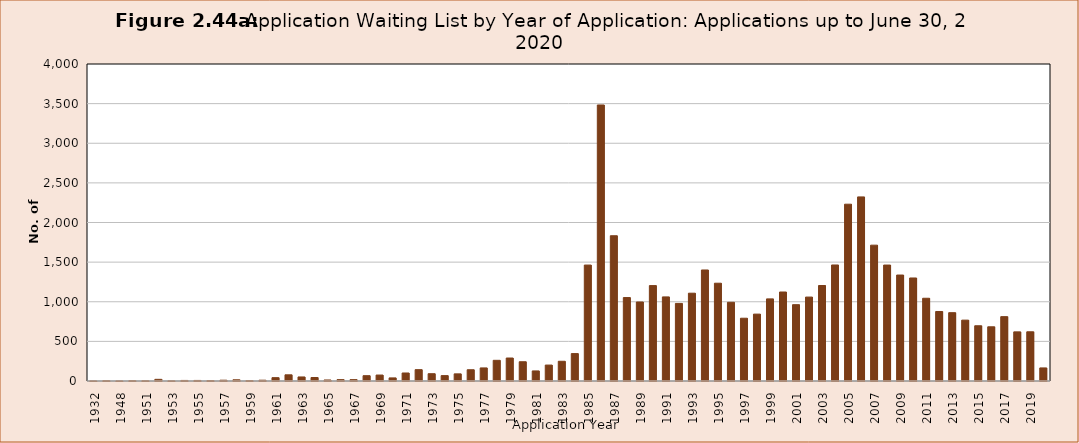
| Category | Series 0 |
|---|---|
| 1932.0 | 1 |
| 1947.0 | 4 |
| 1948.0 | 1 |
| 1950.0 | 4 |
| 1951.0 | 3 |
| 1952.0 | 21 |
| 1953.0 | 2 |
| 1954.0 | 7 |
| 1955.0 | 7 |
| 1956.0 | 5 |
| 1957.0 | 10 |
| 1958.0 | 15 |
| 1959.0 | 5 |
| 1960.0 | 10 |
| 1961.0 | 42 |
| 1962.0 | 78 |
| 1963.0 | 51 |
| 1964.0 | 44 |
| 1965.0 | 13 |
| 1966.0 | 17 |
| 1967.0 | 17 |
| 1968.0 | 67 |
| 1969.0 | 75 |
| 1970.0 | 39 |
| 1971.0 | 101 |
| 1972.0 | 143 |
| 1973.0 | 92 |
| 1974.0 | 68 |
| 1975.0 | 90 |
| 1976.0 | 142 |
| 1977.0 | 165 |
| 1978.0 | 261 |
| 1979.0 | 290 |
| 1980.0 | 243 |
| 1981.0 | 127 |
| 1982.0 | 201 |
| 1983.0 | 249 |
| 1984.0 | 346 |
| 1985.0 | 1463 |
| 1986.0 | 3483 |
| 1987.0 | 1833 |
| 1988.0 | 1053 |
| 1989.0 | 997 |
| 1990.0 | 1204 |
| 1991.0 | 1061 |
| 1992.0 | 979 |
| 1993.0 | 1108 |
| 1994.0 | 1401 |
| 1995.0 | 1234 |
| 1996.0 | 993 |
| 1997.0 | 792 |
| 1998.0 | 844 |
| 1999.0 | 1036 |
| 2000.0 | 1123 |
| 2001.0 | 963 |
| 2002.0 | 1059 |
| 2003.0 | 1205 |
| 2004.0 | 1464 |
| 2005.0 | 2231 |
| 2006.0 | 2323 |
| 2007.0 | 1714 |
| 2008.0 | 1463 |
| 2009.0 | 1337 |
| 2010.0 | 1300 |
| 2011.0 | 1044 |
| 2012.0 | 877 |
| 2013.0 | 862 |
| 2014.0 | 768 |
| 2015.0 | 697 |
| 2016.0 | 684 |
| 2017.0 | 812 |
| 2018.0 | 620 |
| 2019.0 | 621 |
| 2020.0 | 165 |